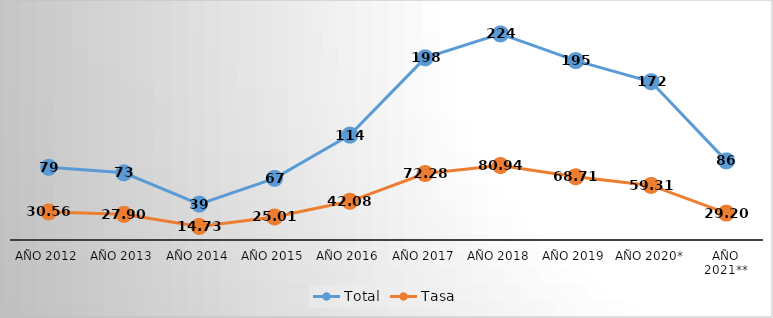
| Category | Total | Tasa |
|---|---|---|
| Año 2012 | 79 | 30.559 |
| Año 2013 | 73 | 27.899 |
| Año 2014 | 39 | 14.729 |
| Año 2015 | 67 | 25.014 |
| Año 2016 | 114 | 42.081 |
| Año 2017 | 198 | 72.282 |
| Año 2018 | 224 | 80.941 |
| Año 2019 | 195 | 68.712 |
| Año 2020* | 172 | 59.312 |
| Año 2021** | 86 | 29.197 |